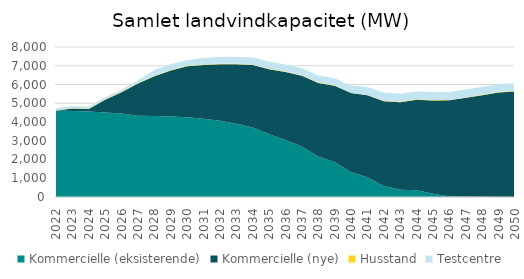
| Category | Kommercielle (eksisterende) | Kommercielle (nye) | Husstand | Testcentre |
|---|---|---|---|---|
| 2022.0 | 4609.82 | 0 | 22.1 | 110 |
| 2023.0 | 4582.886 | 131.2 | 22.2 | 110 |
| 2024.0 | 4561.106 | 131.2 | 22.3 | 110 |
| 2025.0 | 4505.977 | 679.9 | 22.4 | 110 |
| 2026.0 | 4457.842 | 1128.9 | 22.5 | 110 |
| 2027.0 | 4339.992 | 1712.6 | 22.6 | 150 |
| 2028.0 | 4318.717 | 2122.6 | 22.7 | 310 |
| 2029.0 | 4289.062 | 2462.6 | 22.8 | 310 |
| 2030.0 | 4250.112 | 2722.6 | 22.9 | 310 |
| 2031.0 | 4169.262 | 2872.6 | 23 | 350 |
| 2032.0 | 4060.187 | 3022.6 | 23.1 | 380 |
| 2033.0 | 3910.419 | 3172.6 | 23.2 | 380 |
| 2034.0 | 3711.639 | 3322.6 | 23.3 | 380 |
| 2035.0 | 3340.955 | 3472.6 | 23.4 | 380 |
| 2036.0 | 3040.77 | 3622.6 | 23.5 | 380 |
| 2037.0 | 2690.94 | 3772.6 | 23.6 | 380 |
| 2038.0 | 2159.025 | 3922.6 | 23.7 | 380 |
| 2039.0 | 1862.82 | 4072.6 | 23.8 | 380 |
| 2040.0 | 1319.935 | 4222.6 | 23.9 | 380 |
| 2041.0 | 1048.83 | 4372.6 | 24 | 420 |
| 2042.0 | 586.965 | 4522.6 | 24.1 | 420 |
| 2043.0 | 383.81 | 4672.6 | 24.2 | 420 |
| 2044.0 | 360.735 | 4822.6 | 24.3 | 420 |
| 2045.0 | 176.58 | 4972.6 | 24.4 | 420 |
| 2046.0 | 30.78 | 5122.6 | 24.5 | 420 |
| 2047.0 | 14.13 | 5272.6 | 24.6 | 420 |
| 2048.0 | 7.68 | 5422.6 | 24.7 | 420 |
| 2049.0 | 5.13 | 5572.6 | 24.8 | 420 |
| 2050.0 | 5.055 | 5621.4 | 24.9 | 420 |